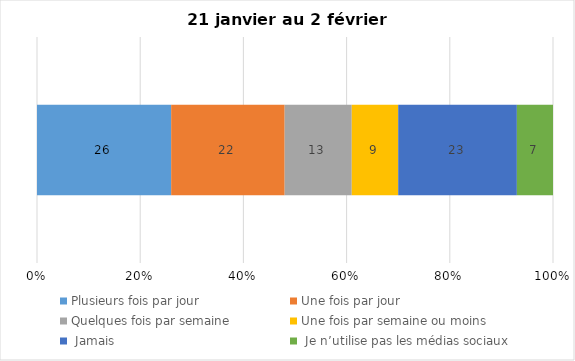
| Category | Plusieurs fois par jour | Une fois par jour | Quelques fois par semaine   | Une fois par semaine ou moins   |  Jamais   |  Je n’utilise pas les médias sociaux |
|---|---|---|---|---|---|---|
| 0 | 26 | 22 | 13 | 9 | 23 | 7 |